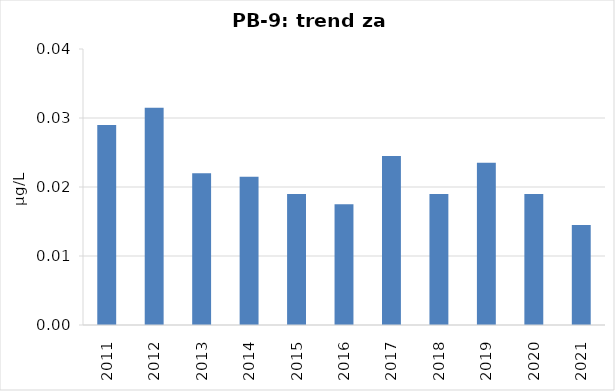
| Category | Vsota |
|---|---|
| 2011 | 0.029 |
| 2012 | 0.032 |
| 2013 | 0.022 |
| 2014 | 0.022 |
| 2015 | 0.019 |
| 2016 | 0.018 |
| 2017 | 0.024 |
| 2018 | 0.019 |
| 2019 | 0.024 |
| 2020 | 0.019 |
| 2021 | 0.014 |